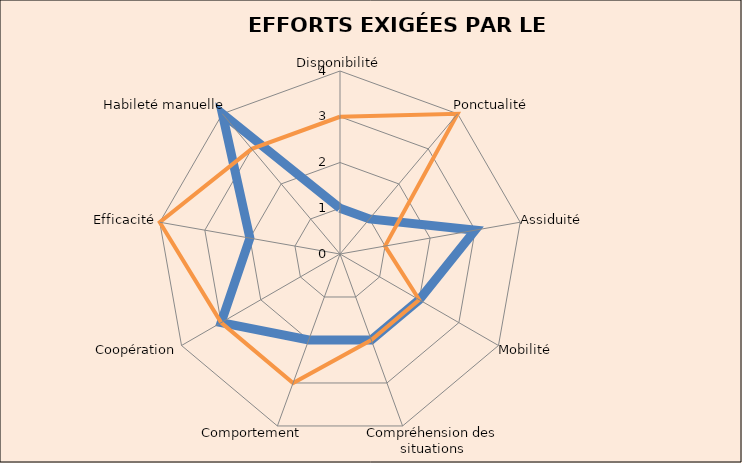
| Category | Series 1 | Series 0 |
|---|---|---|
| Disponibilité | 1 | 3 |
| Ponctualité | 1 | 4 |
| Assiduité | 3 | 1 |
| Mobilité | 2 | 2 |
| Compréhension des situations | 2 | 2 |
| Comportement | 2 | 3 |
| Coopération | 3 | 3 |
| Efficacité | 2 | 4 |
| Habileté manuelle | 4 | 3 |